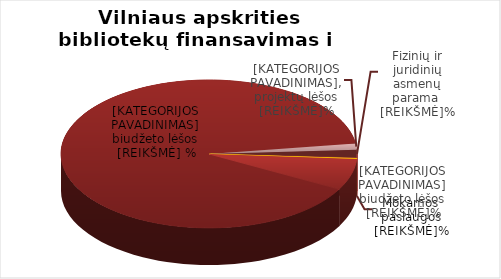
| Category | Series 0 |
|---|---|
| Programų | 1.3 |
| Parama | 1.8 |
| Mokamos paslaugos | 0.2 |
| Valstybės | 6.8 |
| Savivaldybės | 89.8 |